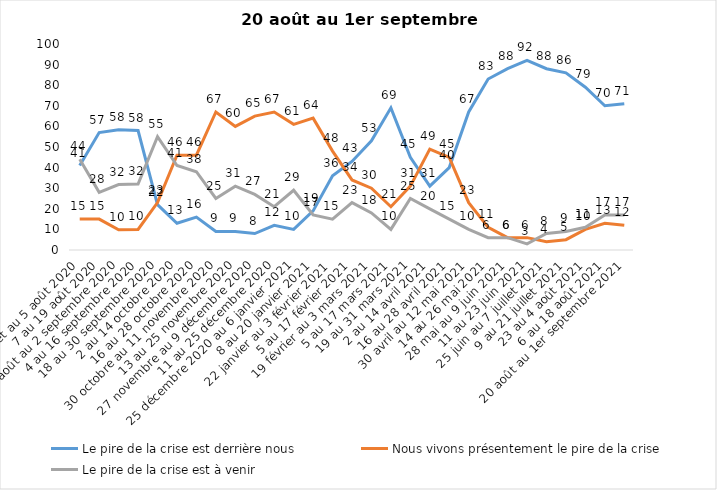
| Category | Le pire de la crise est derrière nous | Nous vivons présentement le pire de la crise | Le pire de la crise est à venir |
|---|---|---|---|
| 24 juillet au 5 août 2020 | 41 | 15 | 44 |
| 7 au 19 août 2020 | 57 | 15 | 28 |
| 21 août au 2 septembre 2020 | 58.39 | 9.84 | 31.77 |
| 4 au 16 septembre 2020 | 58 | 10 | 32 |
| 18 au 30 septembre 2020 | 22 | 23 | 55 |
| 2 au 14 octobre 2020 | 13 | 46 | 41 |
| 16 au 28 octobre 2020 | 16 | 46 | 38 |
| 30 octobre au 11 novembre 2020 | 9 | 67 | 25 |
| 13 au 25 novembre 2020 | 9 | 60 | 31 |
| 27 novembre au 9 décembre 2020 | 8 | 65 | 27 |
| 11 au 25 décembre 2020 | 12 | 67 | 21 |
| 25 décembre 2020 au 6 janvier 2021 | 10 | 61 | 29 |
| 8 au 20 janvier 2021 | 19 | 64 | 17 |
| 22 janvier au 3 février 2021 | 36 | 48 | 15 |
| 5 au 17 février 2021 | 43 | 34 | 23 |
| 19 février au 3 mars 2021 | 53 | 30 | 18 |
| 5 au 17 mars 2021 | 69 | 21 | 10 |
| 19 au 31 mars 2021 | 45 | 31 | 25 |
| 2 au 14 avril 2021 | 31 | 49 | 20 |
| 16 au 28 avril 2021 | 40 | 45 | 15 |
| 30 avril au 12 mai 2021 | 67 | 23 | 10 |
| 14 au 26 mai 2021 | 83 | 11 | 6 |
| 28 mai au 9 juin 2021 | 88 | 6 | 6 |
| 11 au 23 juin 2021 | 92 | 6 | 3 |
| 25 juin au 7 juillet 2021 | 88 | 4 | 8 |
| 9 au 21 juillet 2021 | 86 | 5 | 9 |
| 23 au 4 août 2021 | 79 | 10 | 11 |
| 6 au 18 août 2021 | 70 | 13 | 17 |
| 20 août au 1er septembre 2021 | 71 | 12 | 17 |